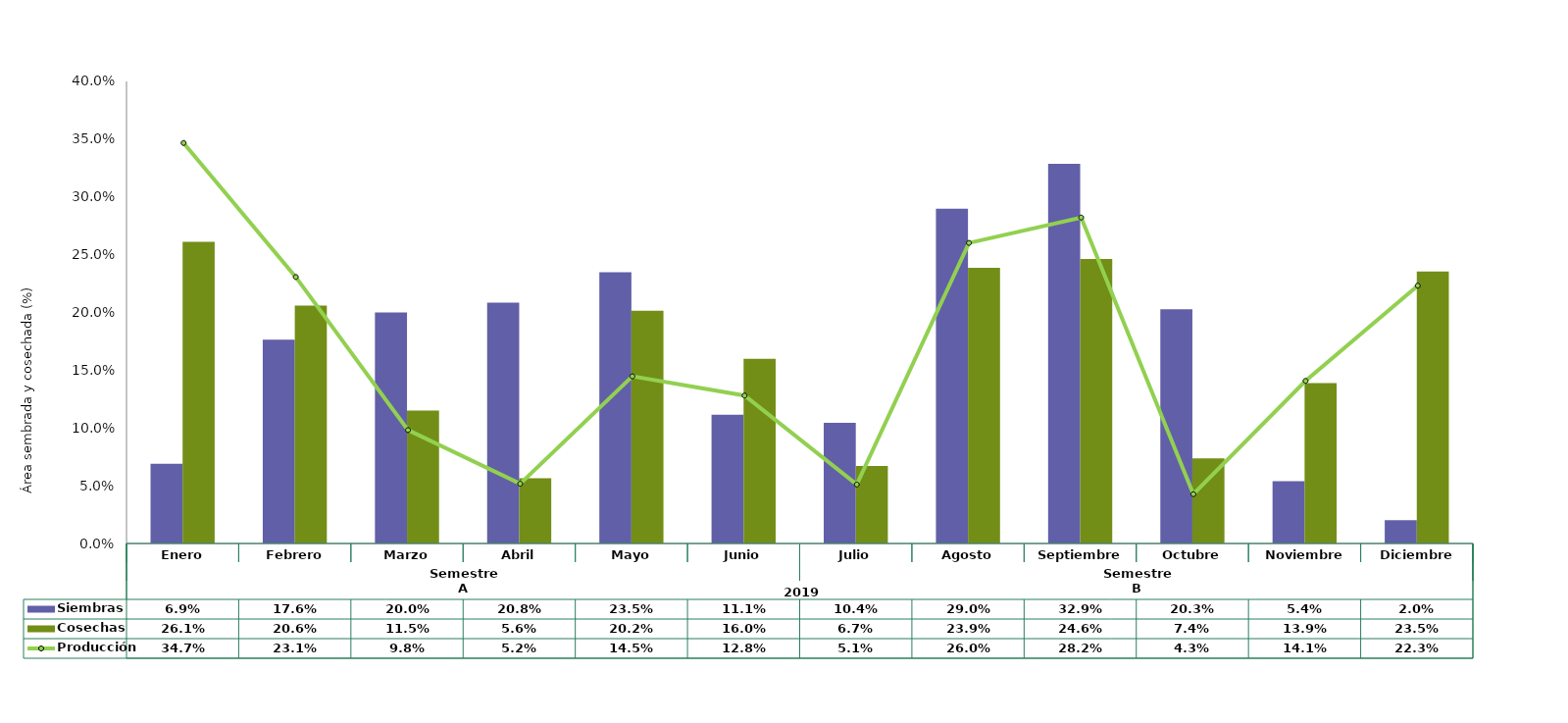
| Category | Siembras | Cosechas   |
|---|---|---|
| 0 | 0.069 | 0.261 |
| 1 | 0.176 | 0.206 |
| 2 | 0.2 | 0.115 |
| 3 | 0.208 | 0.056 |
| 4 | 0.235 | 0.202 |
| 5 | 0.111 | 0.16 |
| 6 | 0.104 | 0.067 |
| 7 | 0.29 | 0.239 |
| 8 | 0.329 | 0.246 |
| 9 | 0.203 | 0.074 |
| 10 | 0.054 | 0.139 |
| 11 | 0.02 | 0.235 |